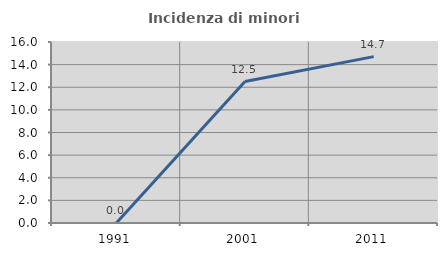
| Category | Incidenza di minori stranieri |
|---|---|
| 1991.0 | 0 |
| 2001.0 | 12.5 |
| 2011.0 | 14.706 |